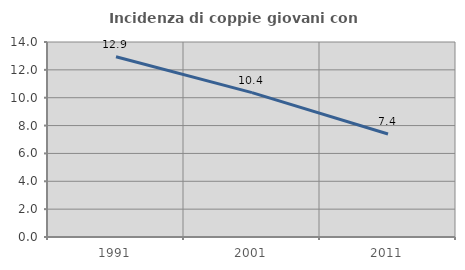
| Category | Incidenza di coppie giovani con figli |
|---|---|
| 1991.0 | 12.945 |
| 2001.0 | 10.364 |
| 2011.0 | 7.399 |